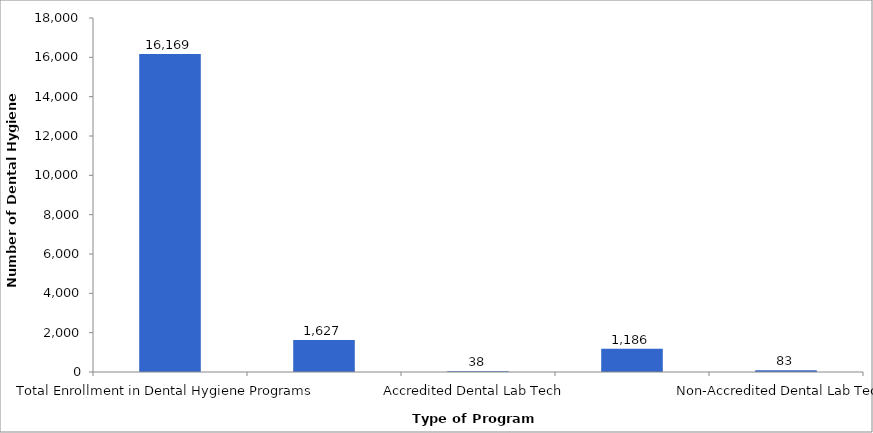
| Category | Number of Dental Hygiene Students |
|---|---|
| Total Enrollment in Dental Hygiene Programs | 16169 |
| Accredited Dental Assisting | 1627 |
| Accredited Dental Lab Tech | 38 |
| Non-Accredited Dental Assisting | 1186 |
| Non-Accredited Dental Lab Tech | 83 |